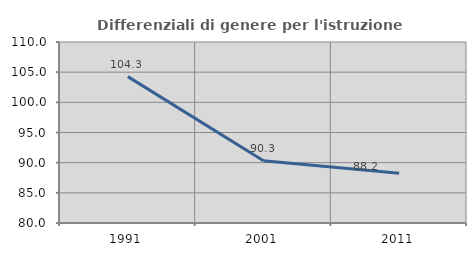
| Category | Differenziali di genere per l'istruzione superiore |
|---|---|
| 1991.0 | 104.264 |
| 2001.0 | 90.302 |
| 2011.0 | 88.241 |